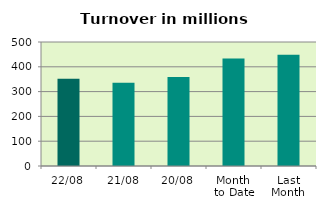
| Category | Series 0 |
|---|---|
| 22/08 | 351.357 |
| 21/08 | 335.609 |
| 20/08 | 358.37 |
| Month 
to Date | 433.435 |
| Last
Month | 448.907 |